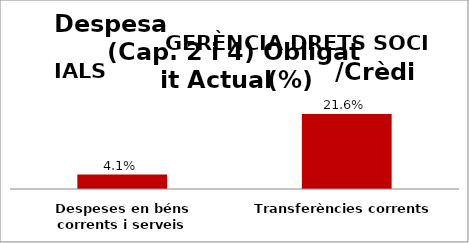
| Category | Series 0 |
|---|---|
| Despeses en béns corrents i serveis | 0.041 |
| Transferències corrents | 0.216 |